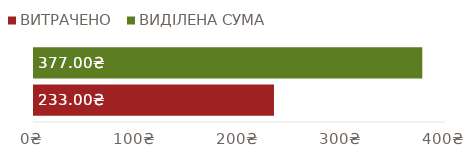
| Category | ВИТРАЧЕНО | ВИДІЛЕНА СУМА |
|---|---|---|
| УСЬОГО | 233 | 377 |